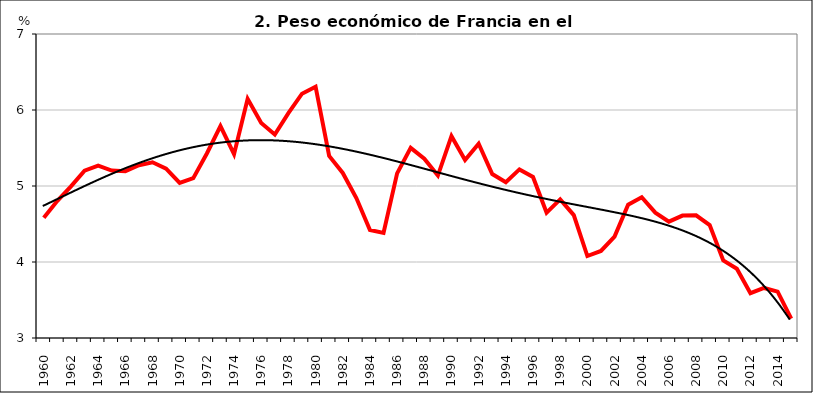
| Category | Series 0 |
|---|---|
| 1960 | 4.582 |
| 1961 | 4.805 |
| 1962 | 4.995 |
| 1963 | 5.202 |
| 1964 | 5.267 |
| 1965 | 5.204 |
| 1966 | 5.194 |
| 1967 | 5.273 |
| 1968 | 5.313 |
| 1969 | 5.228 |
| 1970 | 5.04 |
| 1971 | 5.103 |
| 1972 | 5.428 |
| 1973 | 5.788 |
| 1974 | 5.418 |
| 1975 | 6.147 |
| 1976 | 5.828 |
| 1977 | 5.678 |
| 1978 | 5.958 |
| 1979 | 6.214 |
| 1980 | 6.306 |
| 1981 | 5.396 |
| 1982 | 5.172 |
| 1983 | 4.841 |
| 1984 | 4.421 |
| 1985 | 4.382 |
| 1986 | 5.165 |
| 1987 | 5.501 |
| 1988 | 5.359 |
| 1989 | 5.138 |
| 1990 | 5.656 |
| 1991 | 5.342 |
| 1992 | 5.557 |
| 1993 | 5.157 |
| 1994 | 5.051 |
| 1995 | 5.218 |
| 1996 | 5.119 |
| 1997 | 4.65 |
| 1998 | 4.824 |
| 1999 | 4.617 |
| 2000 | 4.079 |
| 2001 | 4.145 |
| 2002 | 4.334 |
| 2003 | 4.753 |
| 2004 | 4.852 |
| 2005 | 4.65 |
| 2006 | 4.531 |
| 2007 | 4.611 |
| 2008 | 4.615 |
| 2009 | 4.486 |
| 2010 | 4.02 |
| 2011 | 3.912 |
| 2012 | 3.59 |
| 2013 | 3.658 |
| 2014 | 3.609 |
| 2015 | 3.256 |